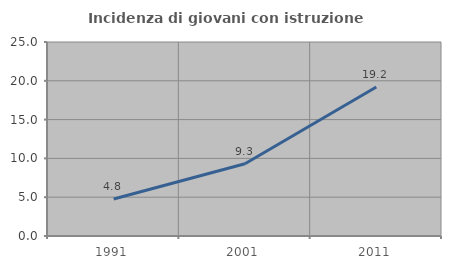
| Category | Incidenza di giovani con istruzione universitaria |
|---|---|
| 1991.0 | 4.769 |
| 2001.0 | 9.307 |
| 2011.0 | 19.195 |